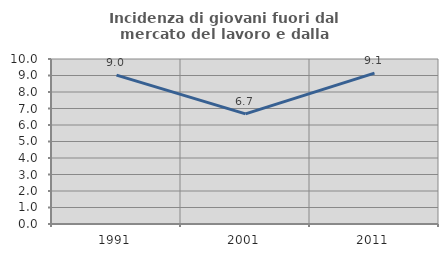
| Category | Incidenza di giovani fuori dal mercato del lavoro e dalla formazione  |
|---|---|
| 1991.0 | 9.026 |
| 2001.0 | 6.675 |
| 2011.0 | 9.14 |